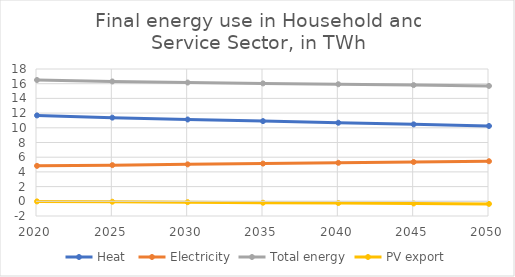
| Category | Heat  | Electricity | Total energy | PV export |
|---|---|---|---|---|
| 2020.0 | 11.683 | 4.821 | 16.505 | -0.013 |
| 2025.0 | 11.383 | 4.921 | 16.305 | -0.057 |
| 2030.0 | 11.131 | 5.025 | 16.156 | -0.12 |
| 2035.0 | 10.91 | 5.131 | 16.041 | -0.194 |
| 2040.0 | 10.689 | 5.237 | 15.926 | -0.236 |
| 2045.0 | 10.467 | 5.343 | 15.811 | -0.295 |
| 2050.0 | 10.246 | 5.45 | 15.696 | -0.353 |